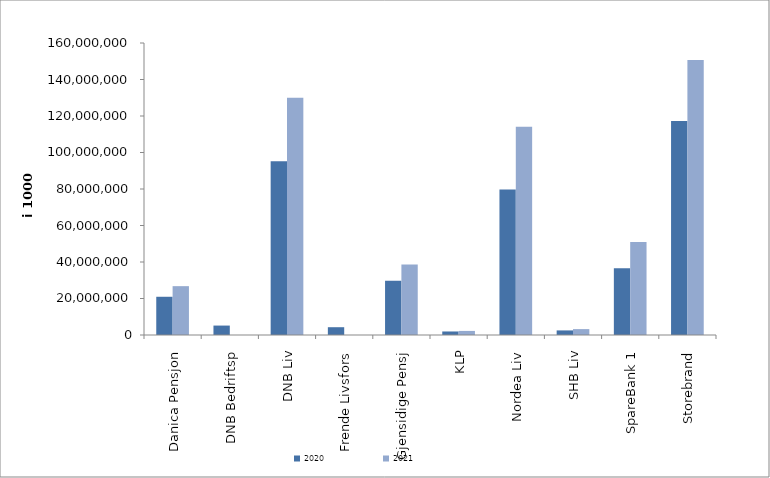
| Category | 2020 | 2021 |
|---|---|---|
| Danica Pensjon | 20948913.26 | 26763939.773 |
| DNB Bedriftsp | 5167910 | 0 |
| DNB Liv | 95193910.071 | 129966187.129 |
| Frende Livsfors | 4269268 | 0 |
| Gjensidige Pensj | 29754862.8 | 38652190 |
| KLP | 1933154.621 | 2232813.013 |
| Nordea Liv | 79687040 | 114051500 |
| SHB Liv | 2514066.68 | 3229114.563 |
| SpareBank 1 | 36536483.393 | 50948452.248 |
| Storebrand | 117297307.317 | 150707923.691 |